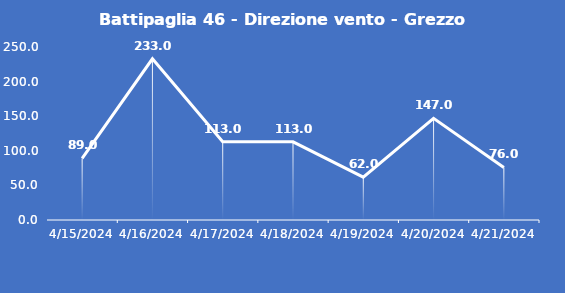
| Category | Battipaglia 46 - Direzione vento - Grezzo (°N) |
|---|---|
| 4/15/24 | 89 |
| 4/16/24 | 233 |
| 4/17/24 | 113 |
| 4/18/24 | 113 |
| 4/19/24 | 62 |
| 4/20/24 | 147 |
| 4/21/24 | 76 |